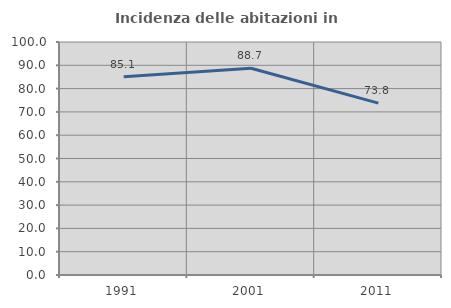
| Category | Incidenza delle abitazioni in proprietà  |
|---|---|
| 1991.0 | 85.073 |
| 2001.0 | 88.722 |
| 2011.0 | 73.784 |